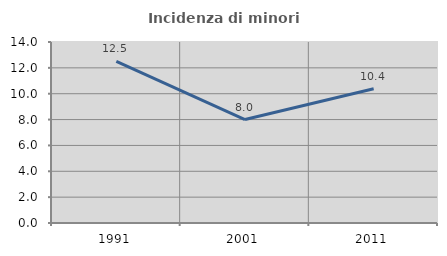
| Category | Incidenza di minori stranieri |
|---|---|
| 1991.0 | 12.5 |
| 2001.0 | 8 |
| 2011.0 | 10.39 |